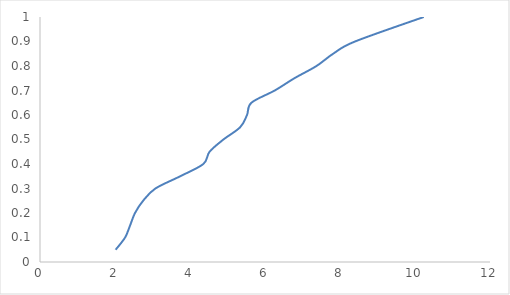
| Category | Series 0 |
|---|---|
| 2.0166666666666773 | 0.05 |
| 2.2688888888889007 | 0.1 |
| 2.40444444444445 | 0.15 |
| 2.533333333333327 | 0.2 |
| 2.7499999999999747 | 0.25 |
| 3.0777777777777313 | 0.3 |
| 3.7388888888889005 | 0.35 |
| 4.355555555555552 | 0.4 |
| 4.521666666666664 | 0.45 |
| 4.891666666666655 | 0.5 |
| 5.3374999999999675 | 0.55 |
| 5.519999999999947 | 0.6 |
| 5.636666666666611 | 0.65 |
| 6.260000000000031 | 0.7 |
| 6.783333333333344 | 0.75 |
| 7.373333333333364 | 0.8 |
| 7.816666666666673 | 0.85 |
| 8.399999999999991 | 0.9 |
| 10.233333333333405 | 1 |